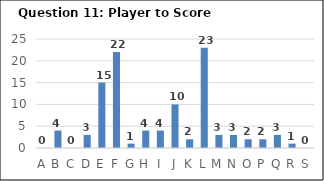
| Category | Series 0 |
|---|---|
| A | 0 |
| B | 4 |
| C | 0 |
| D | 3 |
| E | 15 |
| F | 22 |
| G | 1 |
| H | 4 |
| I | 4 |
| J | 10 |
| K | 2 |
| L | 23 |
| M | 3 |
| N | 3 |
| O | 2 |
| P | 2 |
| Q | 3 |
| R | 1 |
| S | 0 |